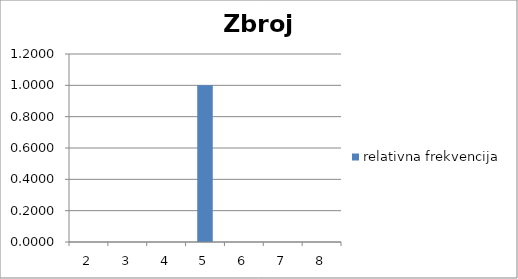
| Category | relativna frekvencija |
|---|---|
| 2.0 | 0 |
| 3.0 | 0 |
| 4.0 | 0 |
| 5.0 | 1 |
| 6.0 | 0 |
| 7.0 | 0 |
| 8.0 | 0 |